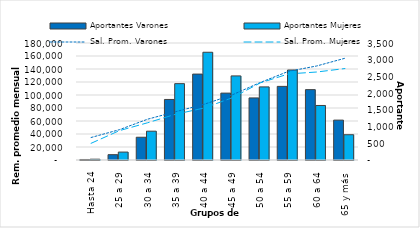
| Category | Aportantes Varones | Aportantes Mujeres |
|---|---|---|
| Hasta 24 | 15 | 24 |
| 25 a 29 | 159 | 237 |
| 30 a 34 | 681 | 862 |
| 35 a 39 | 1811 | 2284 |
| 40 a 44 | 2570 | 3223 |
| 45 a 49 | 2001 | 2516 |
| 50 a 54 | 1857 | 2187 |
| 55 a 59 | 2202 | 2692 |
| 60 a 64 | 2105 | 1631 |
| 65 y más | 1193 | 756 |